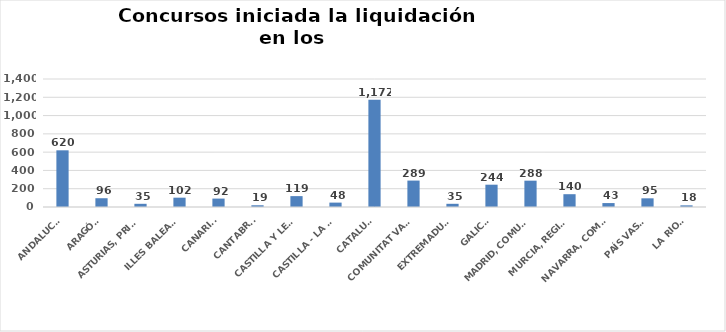
| Category | Series 0 |
|---|---|
| ANDALUCÍA | 620 |
| ARAGÓN | 96 |
| ASTURIAS, PRINCIPADO | 35 |
| ILLES BALEARS | 102 |
| CANARIAS | 92 |
| CANTABRIA | 19 |
| CASTILLA Y LEÓN | 119 |
| CASTILLA - LA MANCHA | 48 |
| CATALUÑA | 1172 |
| COMUNITAT VALENCIANA | 289 |
| EXTREMADURA | 35 |
| GALICIA | 244 |
| MADRID, COMUNIDAD | 288 |
| MURCIA, REGIÓN | 140 |
| NAVARRA, COM. FORAL | 43 |
| PAÍS VASCO | 95 |
| LA RIOJA | 18 |